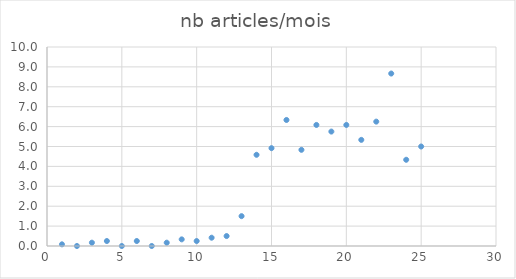
| Category | Series 0 |
|---|---|
| 0 | 0.083 |
| 1 | 0 |
| 2 | 0.167 |
| 3 | 0.25 |
| 4 | 0 |
| 5 | 0.25 |
| 6 | 0 |
| 7 | 0.167 |
| 8 | 0.333 |
| 9 | 0.25 |
| 10 | 0.417 |
| 11 | 0.5 |
| 12 | 1.5 |
| 13 | 4.583 |
| 14 | 4.917 |
| 15 | 6.333 |
| 16 | 4.833 |
| 17 | 6.083 |
| 18 | 5.75 |
| 19 | 6.083 |
| 20 | 5.333 |
| 21 | 6.25 |
| 22 | 8.667 |
| 23 | 4.333 |
| 24 | 5 |